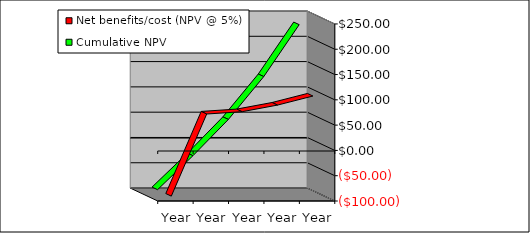
| Category | Net benefits/cost (NPV @ 5%) | Cumulative NPV |
|---|---|---|
| Year 1 | -95.238 | -95.238 |
| Year 2 | 67.12 | -28.118 |
| Year 3 | 71.699 | 43.581 |
| Year 4 | 84.738 | 128.319 |
| Year 5 | 102.642 | 230.961 |